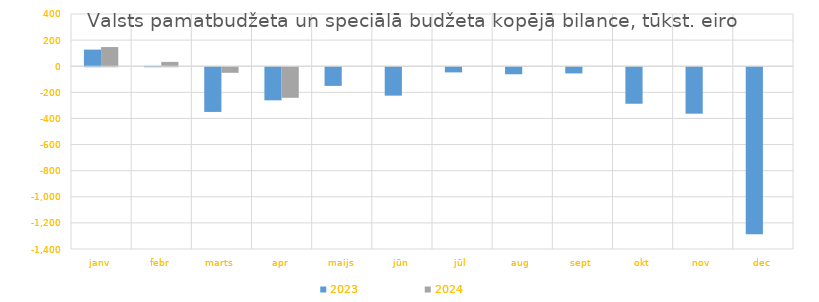
| Category | 2023 | 2024 |
|---|---|---|
| janv | 127204.091 | 146817.044 |
| febr | 2640.716 | 33202.188 |
| marts | -342545.514 | -42828.848 |
| apr | -253652.641 | -234189.401 |
| maijs | -143054.463 | 0 |
| jūn | -217730.866 | 0 |
| jūl | -39678.691 | 0 |
| aug | -53894.673 | 0 |
| sept | -47453.058 | 0 |
| okt | -279789.541 | 0 |
| nov | -356015.19 | 0 |
| dec | -1279587.92 | 0 |